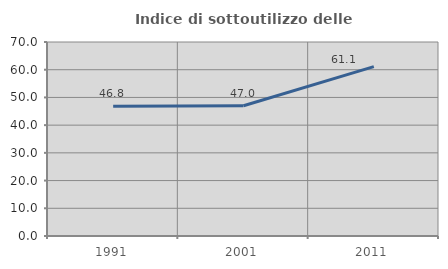
| Category | Indice di sottoutilizzo delle abitazioni  |
|---|---|
| 1991.0 | 46.847 |
| 2001.0 | 47.015 |
| 2011.0 | 61.111 |